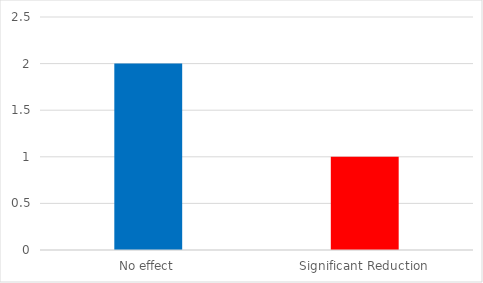
| Category | Series 0 |
|---|---|
| No effect | 2 |
| Significant Reduction | 1 |